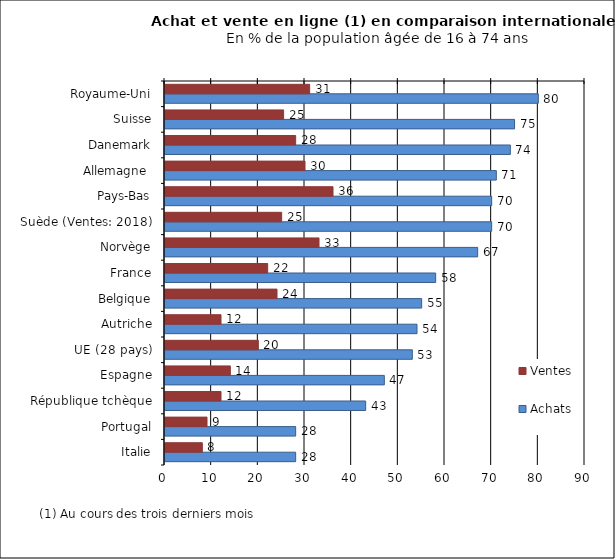
| Category | Achats | Ventes |
|---|---|---|
| Italie | 28 | 8 |
| Portugal | 28 | 9 |
| République tchèque | 43 | 12 |
| Espagne | 47 | 14 |
| UE (28 pays) | 53 | 20 |
| Autriche | 54 | 12 |
| Belgique | 55 | 24 |
| France | 58 | 22 |
| Norvège | 67 | 33 |
| Suède (Ventes: 2018) | 70 | 25 |
| Pays-Bas | 70 | 36 |
| Allemagne  | 71 | 30 |
| Danemark | 74 | 28 |
| Suisse | 74.905 | 25.417 |
| Royaume-Uni | 80 | 31 |